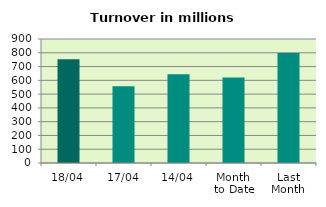
| Category | Series 0 |
|---|---|
| 18/04 | 752.725 |
| 17/04 | 557.132 |
| 14/04 | 644.238 |
| Month 
to Date | 619.793 |
| Last
Month | 798.115 |